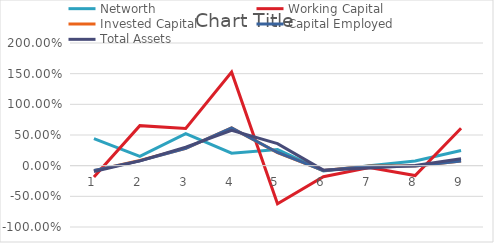
| Category | Networth | Working Capital | Invested Capital | Capital Employed | Total Assets |
|---|---|---|---|---|---|
| 0 | 0.441 | -0.184 | -0.081 | -0.08 | -0.095 |
| 1 | 0.151 | 0.653 | 0.085 | 0.078 | 0.078 |
| 2 | 0.522 | 0.606 | 0.284 | 0.284 | 0.302 |
| 3 | 0.203 | 1.525 | 0.616 | 0.615 | 0.575 |
| 4 | 0.263 | -0.62 | 0.213 | 0.215 | 0.359 |
| 5 | -0.086 | -0.18 | -0.079 | -0.078 | -0.073 |
| 6 | -0.003 | -0.03 | -0.007 | -0.008 | -0.038 |
| 7 | 0.077 | -0.162 | -0.005 | -0.004 | 0.003 |
| 8 | 0.246 | 0.611 | 0.075 | 0.075 | 0.112 |